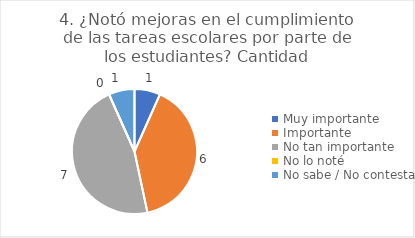
| Category | 4. ¿Notó mejoras en el cumplimiento de las tareas escolares por parte de los estudiantes? |
|---|---|
| Muy importante  | 0.067 |
| Importante  | 0.4 |
| No tan importante  | 0.467 |
| No lo noté  | 0 |
| No sabe / No contesta | 0.067 |